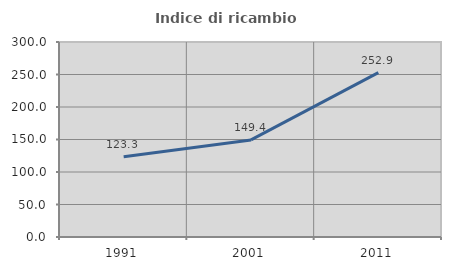
| Category | Indice di ricambio occupazionale  |
|---|---|
| 1991.0 | 123.344 |
| 2001.0 | 149.375 |
| 2011.0 | 252.901 |